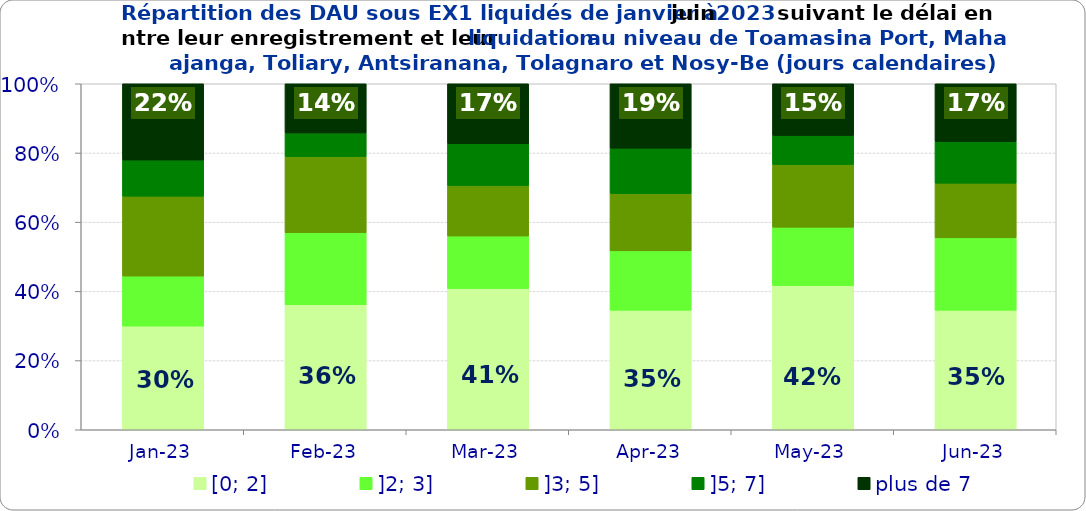
| Category | [0; 2] | ]2; 3] | ]3; 5] | ]5; 7] | plus de 7 |
|---|---|---|---|---|---|
| 2023-01-01 | 0.3 | 0.145 | 0.231 | 0.104 | 0.221 |
| 2023-02-01 | 0.362 | 0.208 | 0.221 | 0.068 | 0.142 |
| 2023-03-01 | 0.408 | 0.152 | 0.146 | 0.121 | 0.173 |
| 2023-04-01 | 0.345 | 0.172 | 0.165 | 0.131 | 0.186 |
| 2023-05-01 | 0.417 | 0.169 | 0.181 | 0.084 | 0.149 |
| 2023-06-01 | 0.345 | 0.209 | 0.158 | 0.12 | 0.167 |